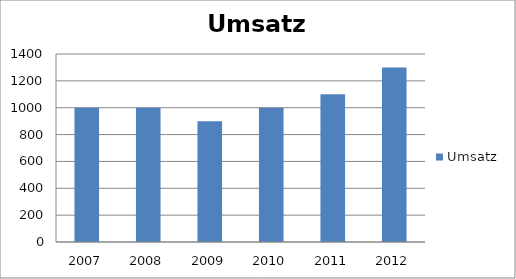
| Category | Umsatz |
|---|---|
| 2007.0 | 1000 |
| 2008.0 | 1000 |
| 2009.0 | 900 |
| 2010.0 | 1000 |
| 2011.0 | 1100 |
| 2012.0 | 1300 |